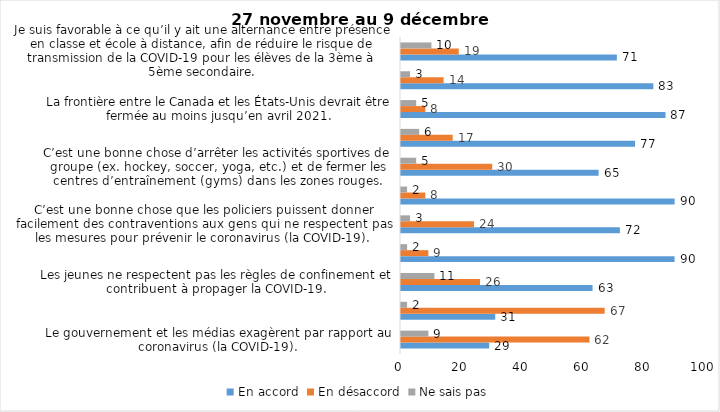
| Category | En accord | En désaccord | Ne sais pas |
|---|---|---|---|
| Le gouvernement et les médias exagèrent par rapport au coronavirus (la COVID-19). | 29 | 62 | 9 |
| Il est exagéré de rester chez soi pour se protéger contre le coronavirus (la COVID-19). | 31 | 67 | 2 |
| Les jeunes ne respectent pas les règles de confinement et contribuent à propager la COVID-19. | 63 | 26 | 11 |
| Je suis favorable à l’obligation de porter le masque ou le couvre-visage dans tous les lieux publics fermés (épiceries, magasins, restaurants, cinéma, lieux de culte, etc.). | 90 | 9 | 2 |
| C’est une bonne chose que les policiers puissent donner facilement des contraventions aux gens qui ne respectent pas les mesures pour prévenir le coronavirus (la COVID-19). | 72 | 24 | 3 |
| Je suis favorable à l’obligation de porter le masque ou le couvre-visage lors des manifestations citoyennes. | 90 | 8 | 2 |
| C’est une bonne chose d’arrêter les activités sportives de groupe (ex. hockey, soccer, yoga, etc.) et de fermer les centres d’entraînement (gyms) dans les zones rouges. | 65 | 30 | 5 |
| Je suis favorable à l’obligation de porter le masque ou le couvre-visage en tout temps pour les élèves au secondaire. | 77 | 17 | 6 |
| La frontière entre le Canada et les États-Unis devrait être fermée au moins jusqu’en avril 2021. | 87 | 8 | 5 |
| J’ai peur que le système de santé soit débordé par les cas de COVID-19 suite à la période des fêtes. | 83 | 14 | 3 |
| Je suis favorable à ce qu’il y ait une alternance entre présence en classe et école à distance, afin de réduire le risque de transmission de la COVID-19 pour les élèves de la 3ème à 5ème secondaire. | 71 | 19 | 10 |